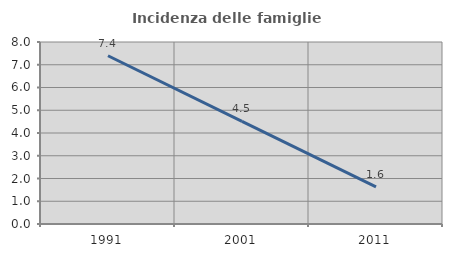
| Category | Incidenza delle famiglie numerose |
|---|---|
| 1991.0 | 7.396 |
| 2001.0 | 4.507 |
| 2011.0 | 1.635 |